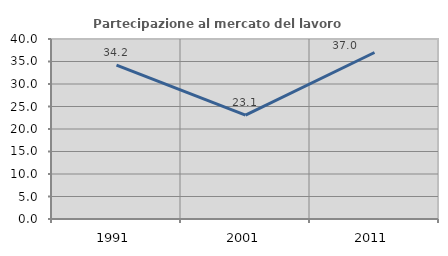
| Category | Partecipazione al mercato del lavoro  femminile |
|---|---|
| 1991.0 | 34.211 |
| 2001.0 | 23.077 |
| 2011.0 | 37 |